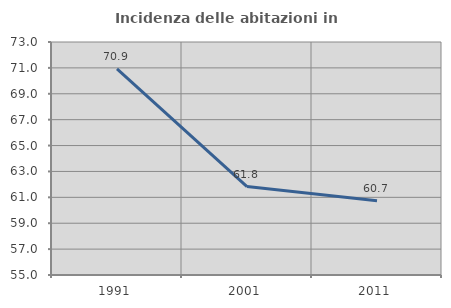
| Category | Incidenza delle abitazioni in proprietà  |
|---|---|
| 1991.0 | 70.922 |
| 2001.0 | 61.832 |
| 2011.0 | 60.744 |